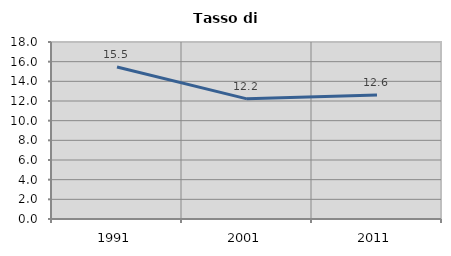
| Category | Tasso di disoccupazione   |
|---|---|
| 1991.0 | 15.459 |
| 2001.0 | 12.217 |
| 2011.0 | 12.615 |